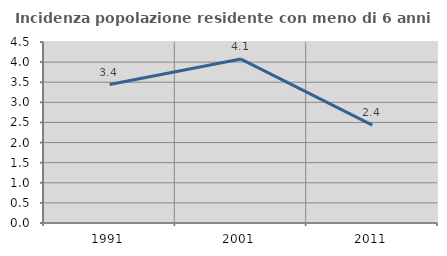
| Category | Incidenza popolazione residente con meno di 6 anni |
|---|---|
| 1991.0 | 3.443 |
| 2001.0 | 4.076 |
| 2011.0 | 2.435 |